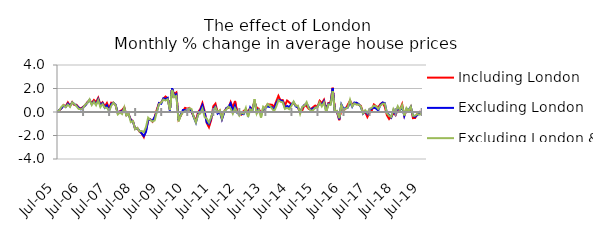
| Category | Including London | Excluding London | Excluding London & SE |
|---|---|---|---|
| 2005-07-01 | 0.005 | -0.018 | 0.075 |
| 2005-08-01 | 0.13 | 0.166 | 0.116 |
| 2005-09-01 | 0.301 | 0.301 | 0.427 |
| 2005-10-01 | 0.587 | 0.545 | 0.588 |
| 2005-11-01 | 0.481 | 0.432 | 0.405 |
| 2005-12-01 | 0.815 | 0.707 | 0.633 |
| 2006-01-01 | 0.512 | 0.507 | 0.437 |
| 2006-02-01 | 0.839 | 0.811 | 0.823 |
| 2006-03-01 | 0.59 | 0.672 | 0.678 |
| 2006-04-01 | 0.61 | 0.551 | 0.495 |
| 2006-05-01 | 0.39 | 0.354 | 0.259 |
| 2006-06-01 | 0.294 | 0.228 | 0.235 |
| 2006-07-01 | 0.43 | 0.396 | 0.326 |
| 2006-08-01 | 0.57 | 0.555 | 0.632 |
| 2006-09-01 | 0.838 | 0.793 | 0.768 |
| 2006-10-01 | 0.993 | 1.026 | 1.075 |
| 2006-11-01 | 0.782 | 0.654 | 0.595 |
| 2006-12-01 | 1.025 | 0.889 | 0.869 |
| 2007-01-01 | 0.837 | 0.672 | 0.578 |
| 2007-02-01 | 1.203 | 1.096 | 1.007 |
| 2007-03-01 | 0.635 | 0.55 | 0.414 |
| 2007-04-01 | 0.824 | 0.747 | 0.672 |
| 2007-05-01 | 0.476 | 0.36 | 0.364 |
| 2007-06-01 | 0.769 | 0.561 | 0.37 |
| 2007-07-01 | 0.305 | 0.103 | 0.071 |
| 2007-08-01 | 0.796 | 0.678 | 0.53 |
| 2007-09-01 | 0.787 | 0.789 | 0.799 |
| 2007-10-01 | 0.58 | 0.618 | 0.582 |
| 2007-11-01 | -0.112 | -0.08 | -0.203 |
| 2007-12-01 | 0.065 | 0.033 | -0.042 |
| 2008-01-01 | 0.173 | 0.053 | -0.176 |
| 2008-02-01 | 0.401 | 0.319 | 0.395 |
| 2008-03-01 | -0.272 | -0.253 | -0.301 |
| 2008-04-01 | -0.195 | -0.208 | -0.153 |
| 2008-05-01 | -0.647 | -0.674 | -0.863 |
| 2008-06-01 | -0.781 | -0.806 | -0.772 |
| 2008-07-01 | -1.442 | -1.448 | -1.464 |
| 2008-08-01 | -1.364 | -1.38 | -1.349 |
| 2008-09-01 | -1.669 | -1.605 | -1.651 |
| 2008-10-01 | -1.821 | -1.81 | -1.611 |
| 2008-11-01 | -2.138 | -2.042 | -1.717 |
| 2008-12-01 | -1.553 | -1.692 | -1.275 |
| 2009-01-01 | -0.731 | -0.692 | -0.481 |
| 2009-02-01 | -0.621 | -0.635 | -0.67 |
| 2009-03-01 | -0.825 | -0.776 | -0.813 |
| 2009-04-01 | -0.427 | -0.431 | -0.716 |
| 2009-05-01 | 0.213 | 0.024 | 0.043 |
| 2009-06-01 | 0.764 | 0.762 | 0.658 |
| 2009-07-01 | 0.798 | 0.703 | 0.801 |
| 2009-08-01 | 1.133 | 1.169 | 1.06 |
| 2009-09-01 | 1.32 | 1.11 | 0.974 |
| 2009-10-01 | 1.163 | 1.205 | 1.086 |
| 2009-11-01 | 0.201 | 0.122 | 0.163 |
| 2009-12-01 | 1.966 | 2.017 | 1.88 |
| 2010-01-01 | 1.507 | 1.365 | 1.254 |
| 2010-02-01 | 1.665 | 1.511 | 1.363 |
| 2010-03-01 | -0.631 | -0.695 | -0.795 |
| 2010-04-01 | -0.333 | -0.243 | -0.277 |
| 2010-05-01 | 0.073 | 0.169 | -0.045 |
| 2010-06-01 | 0.35 | 0.155 | 0.077 |
| 2010-07-01 | 0.284 | 0.116 | -0.038 |
| 2010-08-01 | 0.345 | 0.271 | 0.321 |
| 2010-09-01 | -0.014 | 0.1 | 0.244 |
| 2010-10-01 | -0.392 | -0.437 | -0.408 |
| 2010-11-01 | -0.732 | -0.897 | -0.894 |
| 2010-12-01 | -0.005 | -0.187 | -0.227 |
| 2011-01-01 | 0.24 | 0.151 | -0.122 |
| 2011-02-01 | 0.761 | 0.589 | 0.297 |
| 2011-03-01 | 0.093 | -0.058 | -0.421 |
| 2011-04-01 | -0.951 | -0.897 | -0.565 |
| 2011-05-01 | -1.297 | -1.037 | -0.913 |
| 2011-06-01 | -0.711 | -0.565 | -0.454 |
| 2011-07-01 | 0.487 | 0.241 | 0.1 |
| 2011-08-01 | 0.71 | 0.47 | 0.396 |
| 2011-09-01 | -0.012 | -0.134 | -0.007 |
| 2011-10-01 | 0.126 | 0.028 | 0.154 |
| 2011-11-01 | -0.566 | -0.631 | -0.547 |
| 2011-12-01 | 0.032 | -0.072 | 0.068 |
| 2012-01-01 | 0.323 | 0.321 | 0.219 |
| 2012-02-01 | 0.352 | 0.448 | 0.449 |
| 2012-03-01 | 0.849 | 0.734 | 0.291 |
| 2012-04-01 | 0.375 | 0.058 | -0.146 |
| 2012-05-01 | 0.938 | 0.532 | 0.329 |
| 2012-06-01 | 0.004 | -0.075 | 0.008 |
| 2012-07-01 | -0.1 | -0.164 | -0.316 |
| 2012-08-01 | -0.217 | -0.144 | -0.047 |
| 2012-09-01 | 0.1 | -0.188 | -0.14 |
| 2012-10-01 | 0.185 | 0.178 | 0.349 |
| 2012-11-01 | 0.047 | -0.257 | -0.422 |
| 2012-12-01 | 0.311 | 0.391 | 0.227 |
| 2013-01-01 | 0.331 | 0.109 | 0.093 |
| 2013-02-01 | 0.856 | 0.945 | 1.091 |
| 2013-03-01 | 0.368 | 0.077 | -0.147 |
| 2013-04-01 | 0.266 | 0.191 | 0.173 |
| 2013-05-01 | -0.109 | -0.235 | -0.474 |
| 2013-06-01 | 0.137 | 0.18 | 0.456 |
| 2013-07-01 | 0.377 | 0.345 | 0.307 |
| 2013-08-01 | 0.653 | 0.485 | 0.685 |
| 2013-09-01 | 0.637 | 0.416 | 0.531 |
| 2013-10-01 | 0.618 | 0.426 | 0.312 |
| 2013-11-01 | 0.442 | 0.18 | 0.062 |
| 2013-12-01 | 0.903 | 0.753 | 0.458 |
| 2014-01-01 | 1.372 | 1.029 | 0.994 |
| 2014-02-01 | 0.988 | 0.994 | 0.868 |
| 2014-03-01 | 1.017 | 0.908 | 0.825 |
| 2014-04-01 | 0.553 | 0.367 | 0.264 |
| 2014-05-01 | 0.975 | 0.516 | 0.355 |
| 2014-06-01 | 0.817 | 0.418 | 0.237 |
| 2014-07-01 | 0.649 | 0.686 | 0.517 |
| 2014-08-01 | 0.748 | 0.818 | 0.892 |
| 2014-09-01 | 0.573 | 0.475 | 0.538 |
| 2014-10-01 | 0.364 | 0.4 | 0.542 |
| 2014-11-01 | 0.006 | -0.01 | -0.155 |
| 2014-12-01 | 0.136 | 0.384 | 0.434 |
| 2015-01-01 | 0.576 | 0.597 | 0.529 |
| 2015-02-01 | 0.494 | 0.708 | 0.838 |
| 2015-03-01 | 0.259 | 0.415 | 0.319 |
| 2015-04-01 | 0.24 | 0.138 | 0.098 |
| 2015-05-01 | 0.421 | 0.317 | 0.166 |
| 2015-06-01 | 0.552 | 0.356 | 0.363 |
| 2015-07-01 | 0.44 | 0.456 | 0.417 |
| 2015-08-01 | 0.958 | 0.744 | 0.817 |
| 2015-09-01 | 0.755 | 0.646 | 0.477 |
| 2015-10-01 | 1.043 | 0.918 | 0.806 |
| 2015-11-01 | 0.212 | 0.1 | -0.04 |
| 2015-12-01 | 0.764 | 0.702 | 0.648 |
| 2016-01-01 | 0.798 | 0.671 | 0.602 |
| 2016-02-01 | 2.067 | 2.031 | 1.772 |
| 2016-03-01 | 0.169 | 0.06 | 0.064 |
| 2016-04-01 | -0.006 | 0.058 | 0.096 |
| 2016-05-01 | -0.698 | -0.616 | -0.528 |
| 2016-06-01 | 0.334 | 0.647 | 0.592 |
| 2016-07-01 | 0.14 | 0.27 | 0.149 |
| 2016-08-01 | 0.289 | 0.339 | 0.298 |
| 2016-09-01 | 0.636 | 0.378 | 0.395 |
| 2016-10-01 | 0.968 | 0.862 | 1.043 |
| 2016-11-01 | 0.632 | 0.452 | 0.476 |
| 2016-12-01 | 0.743 | 0.804 | 0.729 |
| 2017-01-01 | 0.778 | 0.782 | 0.623 |
| 2017-02-01 | 0.608 | 0.685 | 0.646 |
| 2017-03-01 | 0.525 | 0.419 | 0.467 |
| 2017-04-01 | -0.033 | -0.143 | -0.121 |
| 2017-05-01 | -0.003 | 0.069 | 0.147 |
| 2017-06-01 | -0.431 | -0.165 | -0.083 |
| 2017-07-01 | -0.06 | 0.194 | 0.265 |
| 2017-08-01 | 0.117 | 0.283 | 0.364 |
| 2017-09-01 | 0.643 | 0.378 | 0.538 |
| 2017-10-01 | 0.49 | 0.292 | 0.493 |
| 2017-11-01 | 0.408 | 0.136 | 0.258 |
| 2017-12-01 | 0.678 | 0.611 | 0.544 |
| 2018-01-01 | 0.789 | 0.81 | 0.694 |
| 2018-02-01 | 0.457 | 0.765 | 0.723 |
| 2018-03-01 | -0.281 | -0.092 | -0.128 |
| 2018-04-01 | -0.595 | -0.244 | -0.303 |
| 2018-05-01 | -0.408 | -0.475 | -0.423 |
| 2018-06-01 | -0.109 | 0.15 | 0.254 |
| 2018-07-01 | -0.264 | -0.203 | -0.053 |
| 2018-08-01 | 0.231 | 0.406 | 0.488 |
| 2018-09-01 | 0.19 | 0.112 | 0.167 |
| 2018-10-01 | 0.668 | 0.465 | 0.584 |
| 2018-11-01 | -0.318 | -0.336 | -0.295 |
| 2018-12-01 | 0.119 | 0.24 | 0.339 |
| 2019-01-01 | 0.042 | 0.178 | 0.083 |
| 2019-02-01 | 0.412 | 0.448 | 0.451 |
| 2019-03-01 | -0.523 | -0.332 | -0.323 |
| 2019-04-01 | -0.508 | -0.416 | -0.307 |
| 2019-05-01 | -0.158 | -0.243 | -0.176 |
| 2019-06-01 | 0.024 | -0.142 | -0.226 |
| 2019-07-01 | -0.005 | -0.088 | -0.098 |
| 2019-08-01 | -0.149 | -0.101 | -0.106 |
| 2019-09-01 | 0.038 | -0.049 | 0.034 |